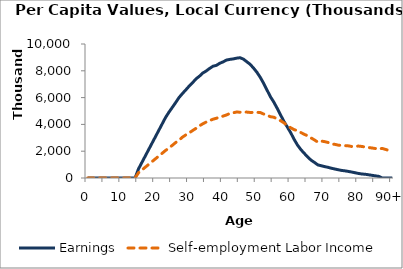
| Category | Earnings | Self-employment Labor Income |
|---|---|---|
| 0 | 0 | 0 |
|  | 0 | 0 |
| 2 | 0 | 0 |
| 3 | 0 | 0 |
| 4 | 0 | 0 |
| 5 | 0 | 0 |
| 6 | 0 | 0 |
| 7 | 0 | 0 |
| 8 | 0 | 0 |
| 9 | 0 | 0 |
| 10 | 0 | 0 |
| 11 | 0 | 0 |
| 12 | 0 | 0 |
| 13 | 0 | 0 |
| 14 | 0 | 0 |
| 15 | 672978.297 | 386291.166 |
| 16 | 1153044.771 | 594698.985 |
| 17 | 1633111.246 | 803106.804 |
| 18 | 2113177.72 | 1011514.622 |
| 19 | 2593244.194 | 1219922.441 |
| 20 | 3073310.669 | 1428330.26 |
| 21 | 3553377.143 | 1636738.079 |
| 22 | 4033443.617 | 1845145.897 |
| 23 | 4513510.092 | 2053553.716 |
| 24 | 4909633.609 | 2243412.492 |
| 25 | 5269275.915 | 2436049.782 |
| 26 | 5632349.602 | 2647710.571 |
| 27 | 6008764.728 | 2831400.846 |
| 28 | 6304829.682 | 3048018.024 |
| 29 | 6577460.209 | 3218698.744 |
| 30 | 6863988.38 | 3371456.859 |
| 31 | 7116006.077 | 3540046.303 |
| 32 | 7397107.127 | 3705484.67 |
| 33 | 7594486.609 | 3886285.708 |
| 34 | 7833608.133 | 4045411.499 |
| 35 | 7981831.664 | 4175523.276 |
| 36 | 8172665.38 | 4280362.629 |
| 37 | 8338996.178 | 4385078.897 |
| 38 | 8402473.694 | 4457612.842 |
| 39 | 8559378.638 | 4539661.346 |
| 40 | 8664989.487 | 4618103.499 |
| 41 | 8800888.591 | 4702759.834 |
| 42 | 8852466.724 | 4820265.724 |
| 43 | 8887258.987 | 4864360.395 |
| 44 | 8943879.158 | 4925912.565 |
| 45 | 8976179.284 | 4907932.502 |
| 46 | 8871913.514 | 4916698.44 |
| 47 | 8676665.561 | 4919235.026 |
| 48 | 8484883.318 | 4891655.658 |
| 49 | 8202562.242 | 4894411.276 |
| 50 | 7889944.672 | 4905564.991 |
| 51 | 7504176.993 | 4884899.362 |
| 52 | 7057877.343 | 4771323.207 |
| 53 | 6552432.219 | 4684565.886 |
| 54 | 6059422.847 | 4573192.918 |
| 55 | 5657471.247 | 4534449.978 |
| 56 | 5194562.291 | 4406139.714 |
| 57 | 4699198.311 | 4275003.882 |
| 58 | 4213765.003 | 4113539.794 |
| 59 | 3797119.744 | 3890351.831 |
| 60 | 3369533.17 | 3748904.991 |
| 61 | 2880583.4 | 3606556.833 |
| 62 | 2451157.785 | 3531004.292 |
| 63 | 2114850.104 | 3390104.011 |
| 64 | 1836642.134 | 3260221.332 |
| 65 | 1569324.988 | 3145211.452 |
| 66 | 1331137.149 | 2989158.165 |
| 67 | 1161359.697 | 2840159.398 |
| 68 | 977205.468 | 2677330.126 |
| 69 | 914811.51 | 2754378.901 |
| 70 | 851243.758 | 2714700.143 |
| 71 | 798108.987 | 2650181.726 |
| 72 | 727911.49 | 2539202.444 |
| 73 | 671779.691 | 2511442.239 |
| 74 | 615885.466 | 2453758.407 |
| 75 | 567010.508 | 2428441.366 |
| 76 | 533423.98 | 2415729.299 |
| 77 | 491577.248 | 2398308.434 |
| 78 | 445097.257 | 2353086.891 |
| 79 | 392153.964 | 2362641.737 |
| 80 | 340353.719 | 2382009.627 |
| 81 | 297916.879 | 2354253.916 |
| 82 | 279581.96 | 2312773.161 |
| 83 | 239989.065 | 2275583.343 |
| 84 | 200396.17 | 2238393.525 |
| 85 | 160803.275 | 2201203.708 |
| 86 | 121210.379 | 2164013.89 |
| 87 | 0 | 2208441.556 |
| 88 | 0 | 2131658.842 |
| 89 | 0 | 2054876.129 |
| 90+ | 0 | 1978093.416 |